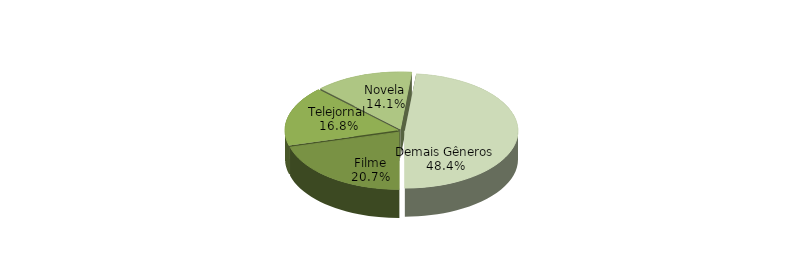
| Category | Series 0 |
|---|---|
| Filme | 0.207 |
| Telejornal | 0.168 |
| Novela | 0.141 |
| Demais Gêneros | 0.484 |